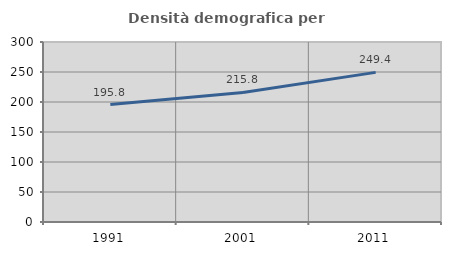
| Category | Densità demografica |
|---|---|
| 1991.0 | 195.828 |
| 2001.0 | 215.847 |
| 2011.0 | 249.37 |